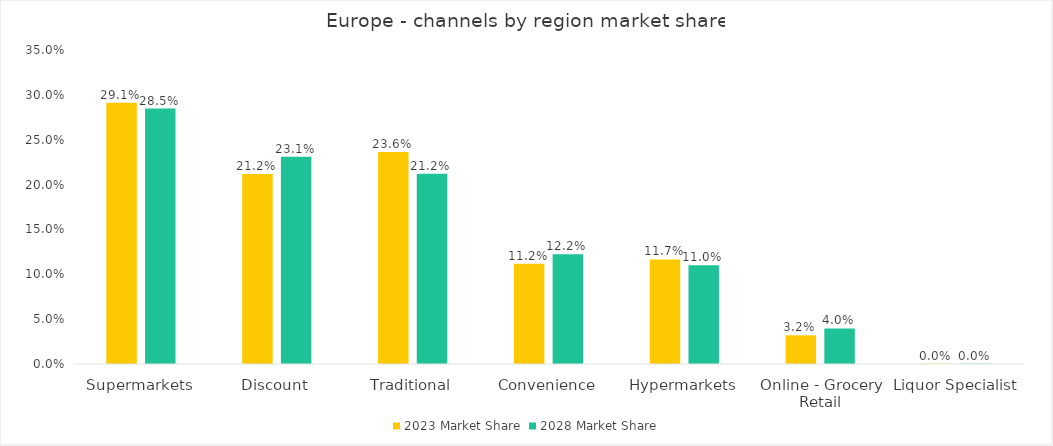
| Category | 2023 Market Share | 2028 Market Share |
|---|---|---|
| Supermarkets | 0.291 | 0.285 |
| Discount | 0.212 | 0.231 |
| Traditional | 0.236 | 0.212 |
| Convenience | 0.112 | 0.122 |
| Hypermarkets | 0.117 | 0.11 |
| Online - Grocery Retail | 0.032 | 0.04 |
| Liquor Specialist | 0 | 0 |